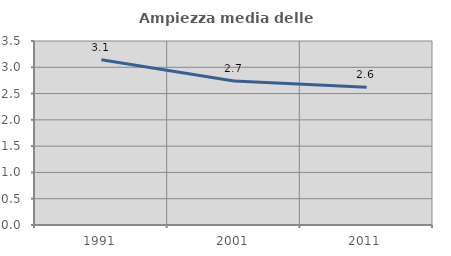
| Category | Ampiezza media delle famiglie |
|---|---|
| 1991.0 | 3.143 |
| 2001.0 | 2.739 |
| 2011.0 | 2.618 |